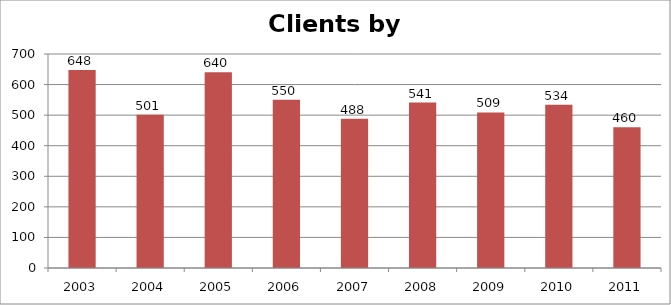
| Category | Clients |
|---|---|
| 2003.0 | 648 |
| 2004.0 | 501 |
| 2005.0 | 640 |
| 2006.0 | 550 |
| 2007.0 | 488 |
| 2008.0 | 541 |
| 2009.0 | 509 |
| 2010.0 | 534 |
| 2011.0 | 460 |